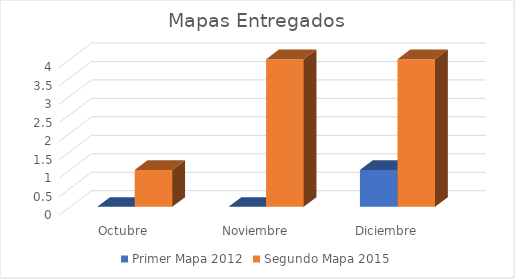
| Category | Primer Mapa 2012 | Segundo Mapa 2015 |
|---|---|---|
| Octubre | 0 | 1 |
| Noviembre | 0 | 4 |
| Diciembre | 1 | 4 |